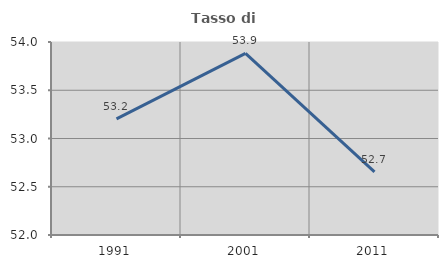
| Category | Tasso di occupazione   |
|---|---|
| 1991.0 | 53.204 |
| 2001.0 | 53.882 |
| 2011.0 | 52.654 |